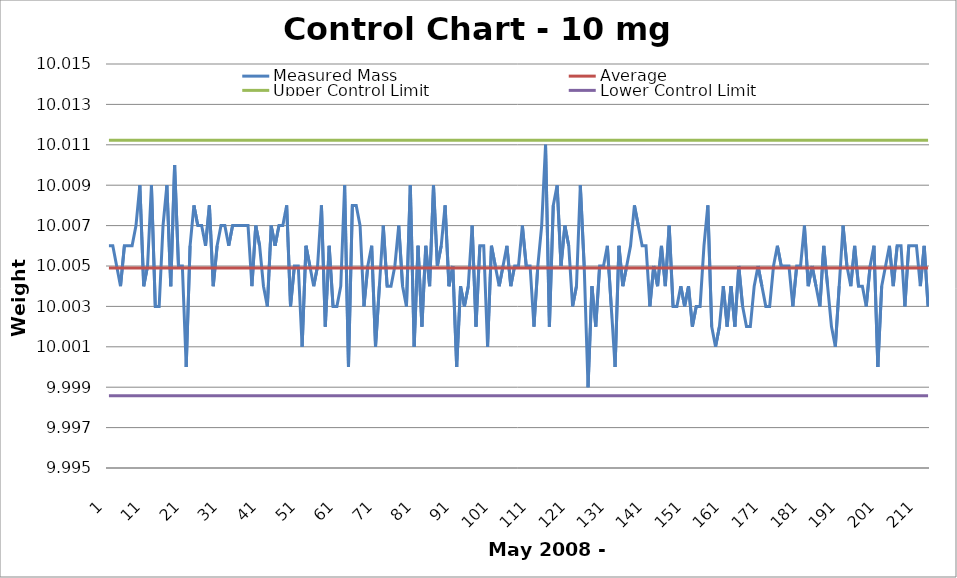
| Category | Measured Mass | Average | Upper Control Limit | Lower Control Limit |
|---|---|---|---|---|
| 1.0 | 10.006 | 10.005 | 10.011 | 9.999 |
| 2.0 | 10.006 | 10.005 | 10.011 | 9.999 |
| 3.0 | 10.005 | 10.005 | 10.011 | 9.999 |
| 4.0 | 10.004 | 10.005 | 10.011 | 9.999 |
| 5.0 | 10.006 | 10.005 | 10.011 | 9.999 |
| 6.0 | 10.006 | 10.005 | 10.011 | 9.999 |
| 7.0 | 10.006 | 10.005 | 10.011 | 9.999 |
| 8.0 | 10.007 | 10.005 | 10.011 | 9.999 |
| 9.0 | 10.009 | 10.005 | 10.011 | 9.999 |
| 10.0 | 10.004 | 10.005 | 10.011 | 9.999 |
| 11.0 | 10.005 | 10.005 | 10.011 | 9.999 |
| 12.0 | 10.009 | 10.005 | 10.011 | 9.999 |
| 13.0 | 10.003 | 10.005 | 10.011 | 9.999 |
| 14.0 | 10.003 | 10.005 | 10.011 | 9.999 |
| 15.0 | 10.007 | 10.005 | 10.011 | 9.999 |
| 16.0 | 10.009 | 10.005 | 10.011 | 9.999 |
| 17.0 | 10.004 | 10.005 | 10.011 | 9.999 |
| 18.0 | 10.01 | 10.005 | 10.011 | 9.999 |
| 19.0 | 10.005 | 10.005 | 10.011 | 9.999 |
| 20.0 | 10.005 | 10.005 | 10.011 | 9.999 |
| 21.0 | 10 | 10.005 | 10.011 | 9.999 |
| 22.0 | 10.006 | 10.005 | 10.011 | 9.999 |
| 23.0 | 10.008 | 10.005 | 10.011 | 9.999 |
| 24.0 | 10.007 | 10.005 | 10.011 | 9.999 |
| 25.0 | 10.007 | 10.005 | 10.011 | 9.999 |
| 26.0 | 10.006 | 10.005 | 10.011 | 9.999 |
| 27.0 | 10.008 | 10.005 | 10.011 | 9.999 |
| 28.0 | 10.004 | 10.005 | 10.011 | 9.999 |
| 29.0 | 10.006 | 10.005 | 10.011 | 9.999 |
| 30.0 | 10.007 | 10.005 | 10.011 | 9.999 |
| 31.0 | 10.007 | 10.005 | 10.011 | 9.999 |
| 32.0 | 10.006 | 10.005 | 10.011 | 9.999 |
| 33.0 | 10.007 | 10.005 | 10.011 | 9.999 |
| 34.0 | 10.007 | 10.005 | 10.011 | 9.999 |
| 35.0 | 10.007 | 10.005 | 10.011 | 9.999 |
| 36.0 | 10.007 | 10.005 | 10.011 | 9.999 |
| 37.0 | 10.007 | 10.005 | 10.011 | 9.999 |
| 38.0 | 10.004 | 10.005 | 10.011 | 9.999 |
| 39.0 | 10.007 | 10.005 | 10.011 | 9.999 |
| 40.0 | 10.006 | 10.005 | 10.011 | 9.999 |
| 41.0 | 10.004 | 10.005 | 10.011 | 9.999 |
| 42.0 | 10.003 | 10.005 | 10.011 | 9.999 |
| 43.0 | 10.007 | 10.005 | 10.011 | 9.999 |
| 44.0 | 10.006 | 10.005 | 10.011 | 9.999 |
| 45.0 | 10.007 | 10.005 | 10.011 | 9.999 |
| 46.0 | 10.007 | 10.005 | 10.011 | 9.999 |
| 47.0 | 10.008 | 10.005 | 10.011 | 9.999 |
| 48.0 | 10.003 | 10.005 | 10.011 | 9.999 |
| 49.0 | 10.005 | 10.005 | 10.011 | 9.999 |
| 50.0 | 10.005 | 10.005 | 10.011 | 9.999 |
| 51.0 | 10.001 | 10.005 | 10.011 | 9.999 |
| 52.0 | 10.006 | 10.005 | 10.011 | 9.999 |
| 53.0 | 10.005 | 10.005 | 10.011 | 9.999 |
| 54.0 | 10.004 | 10.005 | 10.011 | 9.999 |
| 55.0 | 10.005 | 10.005 | 10.011 | 9.999 |
| 56.0 | 10.008 | 10.005 | 10.011 | 9.999 |
| 57.0 | 10.002 | 10.005 | 10.011 | 9.999 |
| 58.0 | 10.006 | 10.005 | 10.011 | 9.999 |
| 59.0 | 10.003 | 10.005 | 10.011 | 9.999 |
| 60.0 | 10.003 | 10.005 | 10.011 | 9.999 |
| 61.0 | 10.004 | 10.005 | 10.011 | 9.999 |
| 62.0 | 10.009 | 10.005 | 10.011 | 9.999 |
| 63.0 | 10 | 10.005 | 10.011 | 9.999 |
| 64.0 | 10.008 | 10.005 | 10.011 | 9.999 |
| 65.0 | 10.008 | 10.005 | 10.011 | 9.999 |
| 66.0 | 10.007 | 10.005 | 10.011 | 9.999 |
| 67.0 | 10.003 | 10.005 | 10.011 | 9.999 |
| 68.0 | 10.005 | 10.005 | 10.011 | 9.999 |
| 69.0 | 10.006 | 10.005 | 10.011 | 9.999 |
| 70.0 | 10.001 | 10.005 | 10.011 | 9.999 |
| 71.0 | 10.004 | 10.005 | 10.011 | 9.999 |
| 72.0 | 10.007 | 10.005 | 10.011 | 9.999 |
| 73.0 | 10.004 | 10.005 | 10.011 | 9.999 |
| 74.0 | 10.004 | 10.005 | 10.011 | 9.999 |
| 75.0 | 10.005 | 10.005 | 10.011 | 9.999 |
| 76.0 | 10.007 | 10.005 | 10.011 | 9.999 |
| 77.0 | 10.004 | 10.005 | 10.011 | 9.999 |
| 78.0 | 10.003 | 10.005 | 10.011 | 9.999 |
| 79.0 | 10.009 | 10.005 | 10.011 | 9.999 |
| 80.0 | 10.001 | 10.005 | 10.011 | 9.999 |
| 81.0 | 10.006 | 10.005 | 10.011 | 9.999 |
| 82.0 | 10.002 | 10.005 | 10.011 | 9.999 |
| 83.0 | 10.006 | 10.005 | 10.011 | 9.999 |
| 84.0 | 10.004 | 10.005 | 10.011 | 9.999 |
| 85.0 | 10.009 | 10.005 | 10.011 | 9.999 |
| 86.0 | 10.005 | 10.005 | 10.011 | 9.999 |
| 87.0 | 10.006 | 10.005 | 10.011 | 9.999 |
| 88.0 | 10.008 | 10.005 | 10.011 | 9.999 |
| 89.0 | 10.004 | 10.005 | 10.011 | 9.999 |
| 90.0 | 10.005 | 10.005 | 10.011 | 9.999 |
| 91.0 | 10 | 10.005 | 10.011 | 9.999 |
| 92.0 | 10.004 | 10.005 | 10.011 | 9.999 |
| 93.0 | 10.003 | 10.005 | 10.011 | 9.999 |
| 94.0 | 10.004 | 10.005 | 10.011 | 9.999 |
| 95.0 | 10.007 | 10.005 | 10.011 | 9.999 |
| 96.0 | 10.002 | 10.005 | 10.011 | 9.999 |
| 97.0 | 10.006 | 10.005 | 10.011 | 9.999 |
| 98.0 | 10.006 | 10.005 | 10.011 | 9.999 |
| 99.0 | 10.001 | 10.005 | 10.011 | 9.999 |
| 100.0 | 10.006 | 10.005 | 10.011 | 9.999 |
| 101.0 | 10.005 | 10.005 | 10.011 | 9.999 |
| 102.0 | 10.004 | 10.005 | 10.011 | 9.999 |
| 103.0 | 10.005 | 10.005 | 10.011 | 9.999 |
| 104.0 | 10.006 | 10.005 | 10.011 | 9.999 |
| 105.0 | 10.004 | 10.005 | 10.011 | 9.999 |
| 106.0 | 10.005 | 10.005 | 10.011 | 9.999 |
| 107.0 | 10.005 | 10.005 | 10.011 | 9.999 |
| 108.0 | 10.007 | 10.005 | 10.011 | 9.999 |
| 109.0 | 10.005 | 10.005 | 10.011 | 9.999 |
| 110.0 | 10.005 | 10.005 | 10.011 | 9.999 |
| 111.0 | 10.002 | 10.005 | 10.011 | 9.999 |
| 112.0 | 10.005 | 10.005 | 10.011 | 9.999 |
| 113.0 | 10.007 | 10.005 | 10.011 | 9.999 |
| 114.0 | 10.011 | 10.005 | 10.011 | 9.999 |
| 115.0 | 10.002 | 10.005 | 10.011 | 9.999 |
| 116.0 | 10.008 | 10.005 | 10.011 | 9.999 |
| 117.0 | 10.009 | 10.005 | 10.011 | 9.999 |
| 118.0 | 10.005 | 10.005 | 10.011 | 9.999 |
| 119.0 | 10.007 | 10.005 | 10.011 | 9.999 |
| 120.0 | 10.006 | 10.005 | 10.011 | 9.999 |
| 121.0 | 10.003 | 10.005 | 10.011 | 9.999 |
| 122.0 | 10.004 | 10.005 | 10.011 | 9.999 |
| 123.0 | 10.009 | 10.005 | 10.011 | 9.999 |
| 124.0 | 10.005 | 10.005 | 10.011 | 9.999 |
| 125.0 | 9.999 | 10.005 | 10.011 | 9.999 |
| 126.0 | 10.004 | 10.005 | 10.011 | 9.999 |
| 127.0 | 10.002 | 10.005 | 10.011 | 9.999 |
| 128.0 | 10.005 | 10.005 | 10.011 | 9.999 |
| 129.0 | 10.005 | 10.005 | 10.011 | 9.999 |
| 130.0 | 10.006 | 10.005 | 10.011 | 9.999 |
| 131.0 | 10.003 | 10.005 | 10.011 | 9.999 |
| 132.0 | 10 | 10.005 | 10.011 | 9.999 |
| 133.0 | 10.006 | 10.005 | 10.011 | 9.999 |
| 134.0 | 10.004 | 10.005 | 10.011 | 9.999 |
| 135.0 | 10.005 | 10.005 | 10.011 | 9.999 |
| 136.0 | 10.006 | 10.005 | 10.011 | 9.999 |
| 137.0 | 10.008 | 10.005 | 10.011 | 9.999 |
| 138.0 | 10.007 | 10.005 | 10.011 | 9.999 |
| 139.0 | 10.006 | 10.005 | 10.011 | 9.999 |
| 140.0 | 10.006 | 10.005 | 10.011 | 9.999 |
| 141.0 | 10.003 | 10.005 | 10.011 | 9.999 |
| 142.0 | 10.005 | 10.005 | 10.011 | 9.999 |
| 143.0 | 10.004 | 10.005 | 10.011 | 9.999 |
| 144.0 | 10.006 | 10.005 | 10.011 | 9.999 |
| 145.0 | 10.004 | 10.005 | 10.011 | 9.999 |
| 146.0 | 10.007 | 10.005 | 10.011 | 9.999 |
| 147.0 | 10.003 | 10.005 | 10.011 | 9.999 |
| 148.0 | 10.003 | 10.005 | 10.011 | 9.999 |
| 149.0 | 10.004 | 10.005 | 10.011 | 9.999 |
| 150.0 | 10.003 | 10.005 | 10.011 | 9.999 |
| 151.0 | 10.004 | 10.005 | 10.011 | 9.999 |
| 152.0 | 10.002 | 10.005 | 10.011 | 9.999 |
| 153.0 | 10.003 | 10.005 | 10.011 | 9.999 |
| 154.0 | 10.003 | 10.005 | 10.011 | 9.999 |
| 155.0 | 10.006 | 10.005 | 10.011 | 9.999 |
| 156.0 | 10.008 | 10.005 | 10.011 | 9.999 |
| 157.0 | 10.002 | 10.005 | 10.011 | 9.999 |
| 158.0 | 10.001 | 10.005 | 10.011 | 9.999 |
| 159.0 | 10.002 | 10.005 | 10.011 | 9.999 |
| 160.0 | 10.004 | 10.005 | 10.011 | 9.999 |
| 161.0 | 10.002 | 10.005 | 10.011 | 9.999 |
| 162.0 | 10.004 | 10.005 | 10.011 | 9.999 |
| 163.0 | 10.002 | 10.005 | 10.011 | 9.999 |
| 164.0 | 10.005 | 10.005 | 10.011 | 9.999 |
| 165.0 | 10.003 | 10.005 | 10.011 | 9.999 |
| 166.0 | 10.002 | 10.005 | 10.011 | 9.999 |
| 167.0 | 10.002 | 10.005 | 10.011 | 9.999 |
| 168.0 | 10.004 | 10.005 | 10.011 | 9.999 |
| 169.0 | 10.005 | 10.005 | 10.011 | 9.999 |
| 170.0 | 10.004 | 10.005 | 10.011 | 9.999 |
| 171.0 | 10.003 | 10.005 | 10.011 | 9.999 |
| 172.0 | 10.003 | 10.005 | 10.011 | 9.999 |
| 173.0 | 10.005 | 10.005 | 10.011 | 9.999 |
| 174.0 | 10.006 | 10.005 | 10.011 | 9.999 |
| 175.0 | 10.005 | 10.005 | 10.011 | 9.999 |
| 176.0 | 10.005 | 10.005 | 10.011 | 9.999 |
| 177.0 | 10.005 | 10.005 | 10.011 | 9.999 |
| 178.0 | 10.003 | 10.005 | 10.011 | 9.999 |
| 179.0 | 10.005 | 10.005 | 10.011 | 9.999 |
| 180.0 | 10.005 | 10.005 | 10.011 | 9.999 |
| 181.0 | 10.007 | 10.005 | 10.011 | 9.999 |
| 182.0 | 10.004 | 10.005 | 10.011 | 9.999 |
| 183.0 | 10.005 | 10.005 | 10.011 | 9.999 |
| 184.0 | 10.004 | 10.005 | 10.011 | 9.999 |
| 185.0 | 10.003 | 10.005 | 10.011 | 9.999 |
| 186.0 | 10.006 | 10.005 | 10.011 | 9.999 |
| 187.0 | 10.004 | 10.005 | 10.011 | 9.999 |
| 188.0 | 10.002 | 10.005 | 10.011 | 9.999 |
| 189.0 | 10.001 | 10.005 | 10.011 | 9.999 |
| 190.0 | 10.004 | 10.005 | 10.011 | 9.999 |
| 191.0 | 10.007 | 10.005 | 10.011 | 9.999 |
| 192.0 | 10.005 | 10.005 | 10.011 | 9.999 |
| 193.0 | 10.004 | 10.005 | 10.011 | 9.999 |
| 194.0 | 10.006 | 10.005 | 10.011 | 9.999 |
| 195.0 | 10.004 | 10.005 | 10.011 | 9.999 |
| 196.0 | 10.004 | 10.005 | 10.011 | 9.999 |
| 197.0 | 10.003 | 10.005 | 10.011 | 9.999 |
| 198.0 | 10.005 | 10.005 | 10.011 | 9.999 |
| 199.0 | 10.006 | 10.005 | 10.011 | 9.999 |
| 200.0 | 10 | 10.005 | 10.011 | 9.999 |
| 201.0 | 10.004 | 10.005 | 10.011 | 9.999 |
| 202.0 | 10.005 | 10.005 | 10.011 | 9.999 |
| 203.0 | 10.006 | 10.005 | 10.011 | 9.999 |
| 204.0 | 10.004 | 10.005 | 10.011 | 9.999 |
| 205.0 | 10.006 | 10.005 | 10.011 | 9.999 |
| 206.0 | 10.006 | 10.005 | 10.011 | 9.999 |
| 207.0 | 10.003 | 10.005 | 10.011 | 9.999 |
| 208.0 | 10.006 | 10.005 | 10.011 | 9.999 |
| 209.0 | 10.006 | 10.005 | 10.011 | 9.999 |
| 210.0 | 10.006 | 10.005 | 10.011 | 9.999 |
| 211.0 | 10.004 | 10.005 | 10.011 | 9.999 |
| 212.0 | 10.006 | 10.005 | 10.011 | 9.999 |
| 213.0 | 10.003 | 10.005 | 10.011 | 9.999 |